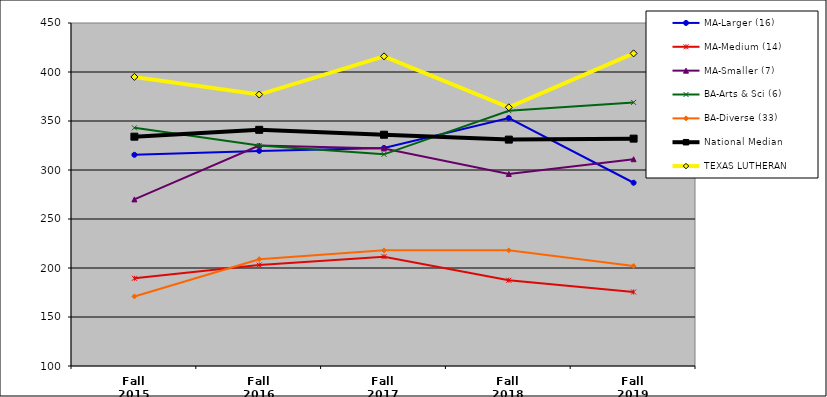
| Category | MA-Larger (16) | MA-Medium (14) | MA-Smaller (7) | BA-Arts & Sci (6) | BA-Diverse (33) | National Median | TEXAS LUTHERAN |
|---|---|---|---|---|---|---|---|
| Fall 2015 | 315.5 | 189.5 | 270 | 343 | 171 | 334 | 395 |
| Fall 2016 | 319.5 | 203 | 325 | 325 | 209 | 341 | 377 |
| Fall 2017 | 322.5 | 211.5 | 322 | 316 | 218 | 336 | 416 |
| Fall 2018 | 353 | 187.5 | 296 | 360.5 | 218 | 331 | 364 |
| Fall 2019 | 287 | 175.5 | 311 | 369 | 202 | 332 | 419 |